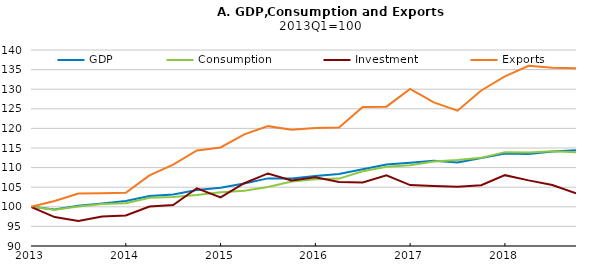
| Category | GDP | Consumption | Investment | Exports |
|---|---|---|---|---|
| 2013-01-01 | 100 | 100 | 100 | 100 |
| 2013-04-01 | 99.304 | 99.257 | 97.379 | 101.487 |
| 2013-07-01 | 100.267 | 100.077 | 96.361 | 103.372 |
| 2013-10-01 | 100.814 | 100.723 | 97.54 | 103.482 |
| 2014-01-01 | 101.464 | 100.931 | 97.778 | 103.566 |
| 2014-04-01 | 102.754 | 102.302 | 100.078 | 108.006 |
| 2014-07-01 | 103.139 | 102.498 | 100.474 | 110.755 |
| 2014-10-01 | 104.281 | 103.024 | 104.726 | 114.391 |
| 2015-01-01 | 104.852 | 103.723 | 102.395 | 115.145 |
| 2015-04-01 | 105.95 | 104.089 | 106.011 | 118.469 |
| 2015-07-01 | 107.247 | 105.076 | 108.508 | 120.576 |
| 2015-10-01 | 107.201 | 106.429 | 106.698 | 119.64 |
| 2016-01-01 | 107.854 | 107.052 | 107.505 | 120.118 |
| 2016-04-01 | 108.365 | 107.194 | 106.32 | 120.233 |
| 2016-07-01 | 109.556 | 109.074 | 106.207 | 125.464 |
| 2016-10-01 | 110.77 | 110.207 | 108.046 | 125.542 |
| 2017-01-01 | 111.257 | 110.611 | 105.533 | 130.068 |
| 2017-04-01 | 111.733 | 111.54 | 105.314 | 126.641 |
| 2017-07-01 | 111.29 | 111.93 | 105.101 | 124.528 |
| 2017-10-01 | 112.467 | 112.487 | 105.489 | 129.676 |
| 2018-01-01 | 113.619 | 113.941 | 108.071 | 133.251 |
| 2018-04-01 | 113.438 | 113.883 | 106.741 | 135.95 |
| 2018-07-01 | 114.125 | 114.176 | 105.553 | 135.453 |
| 2018-10-01 | 114.409 | 113.919 | 103.422 | 135.345 |